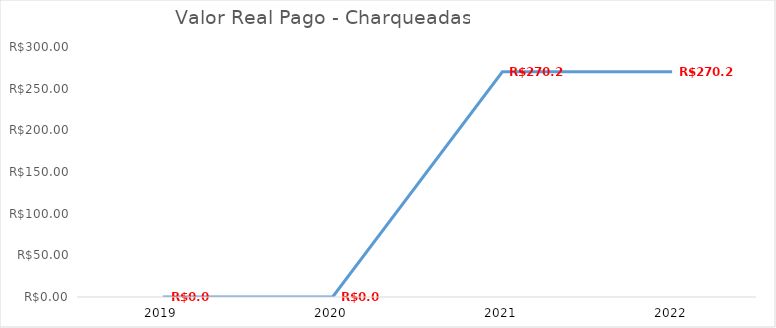
| Category | Series 0 |
|---|---|
| 2019.0 | 0 |
| 2020.0 | 0 |
| 2021.0 | 270.26 |
| 2022.0 | 270.26 |